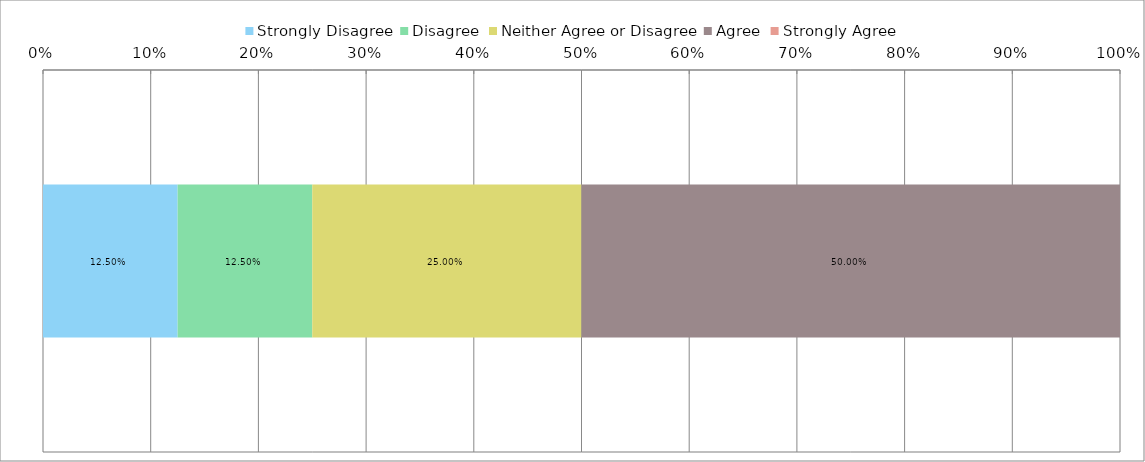
| Category | Strongly Disagree | Disagree | Neither Agree or Disagree | Agree | Strongly Agree |
|---|---|---|---|---|---|
| 0 | 0.125 | 0.125 | 0.25 | 0.5 | 0 |